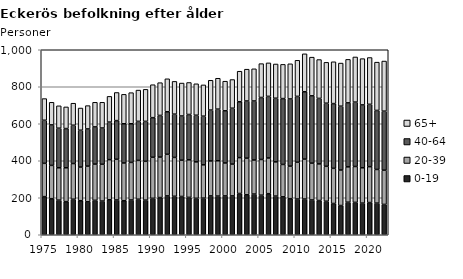
| Category | 0-19 | 20-39 | 40-64 | 65+ |
|---|---|---|---|---|
| 1975.0 | 206 | 180 | 233 | 117 |
| 1976.0 | 195 | 180 | 219 | 122 |
| 1977.0 | 187 | 175 | 214 | 121 |
| 1978.0 | 179 | 183 | 212 | 117 |
| 1979.0 | 192 | 193 | 207 | 119 |
| 1980.0 | 184 | 182 | 199 | 120 |
| 1981.0 | 178 | 193 | 201 | 126 |
| 1982.0 | 186 | 196 | 201 | 133 |
| 1983.0 | 182 | 199 | 196 | 139 |
| 1984.0 | 189 | 217 | 203 | 139 |
| 1985.0 | 188 | 220 | 209 | 152 |
| 1986.0 | 184 | 204 | 212 | 159 |
| 1987.0 | 188 | 203 | 209 | 168 |
| 1988.0 | 192 | 210 | 211 | 169 |
| 1989.0 | 187 | 210 | 216 | 173 |
| 1990.0 | 197 | 222 | 214 | 178 |
| 1991.0 | 201 | 219 | 225 | 177 |
| 1992.0 | 210 | 225 | 230 | 178 |
| 1993.0 | 208 | 210 | 234 | 177 |
| 1994.0 | 207 | 196 | 239 | 178 |
| 1995.0 | 202 | 203 | 245 | 173 |
| 1996.0 | 197 | 197 | 252 | 170 |
| 1997.0 | 198 | 180 | 263 | 169 |
| 1998.0 | 210 | 189 | 275 | 161 |
| 1999.0 | 209 | 191 | 279 | 167 |
| 2000.0 | 210 | 178 | 282 | 160 |
| 2001.0 | 210 | 172 | 302 | 155 |
| 2002.0 | 223 | 194 | 302 | 165 |
| 2003.0 | 216 | 198 | 309 | 172 |
| 2004.0 | 220 | 184 | 319 | 174 |
| 2005.0 | 214 | 193 | 335 | 183 |
| 2006.0 | 222 | 193 | 333 | 181 |
| 2007.0 | 209 | 185 | 344 | 185 |
| 2008.0 | 205 | 175 | 356 | 185 |
| 2009.0 | 195 | 176 | 363 | 190 |
| 2010.0 | 193 | 199 | 356 | 195 |
| 2011.0 | 193 | 216 | 364 | 205 |
| 2012.0 | 188 | 199 | 364 | 209 |
| 2013.0 | 185 | 198 | 354 | 210 |
| 2014.0 | 181 | 189 | 341 | 221 |
| 2015.0 | 169 | 190 | 350 | 226 |
| 2016.0 | 158 | 192 | 345 | 233 |
| 2017.0 | 176 | 191 | 346 | 235 |
| 2018.0 | 175 | 194 | 348 | 244 |
| 2019.0 | 171 | 191 | 340 | 250 |
| 2020.0 | 174 | 194 | 337 | 253 |
| 2021.0 | 171 | 182 | 319 | 261 |
| 2022.0 | 164 | 185 | 319 | 271 |